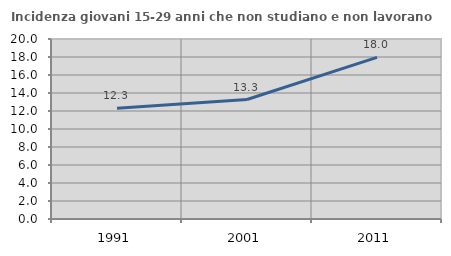
| Category | Incidenza giovani 15-29 anni che non studiano e non lavorano  |
|---|---|
| 1991.0 | 12.311 |
| 2001.0 | 13.277 |
| 2011.0 | 17.957 |